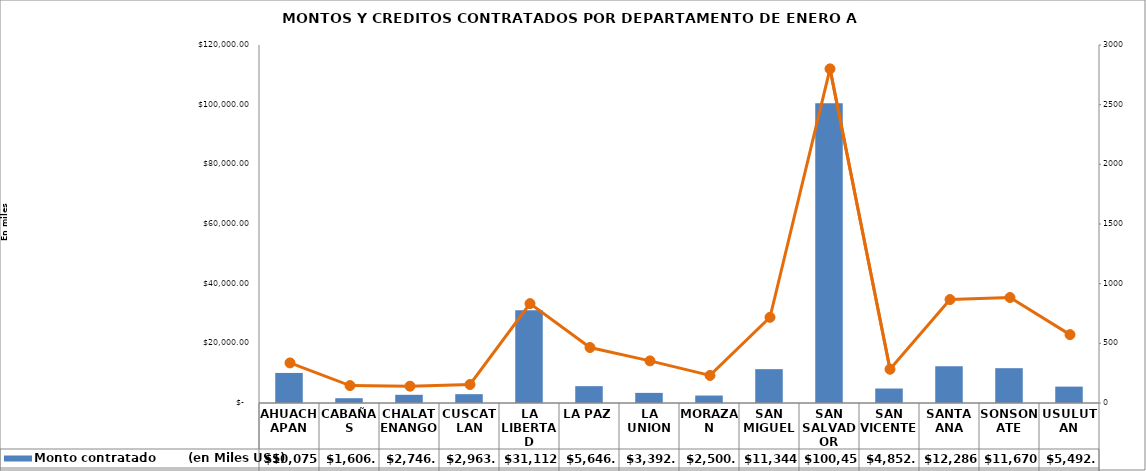
| Category | Monto contratado        (en Miles US$) |
|---|---|
| AHUACHAPAN | 10075.31 |
| CABAÑAS | 1606.336 |
| CHALATENANGO | 2746.649 |
| CUSCATLAN | 2963.916 |
| LA LIBERTAD | 31112.185 |
| LA PAZ | 5646.498 |
| LA UNION | 3392.115 |
| MORAZAN | 2500.056 |
| SAN MIGUEL | 11344.98 |
| SAN SALVADOR | 100454.538 |
| SAN VICENTE | 4852.986 |
| SANTA ANA | 12286.634 |
| SONSONATE | 11670.137 |
| USULUTAN | 5492.084 |